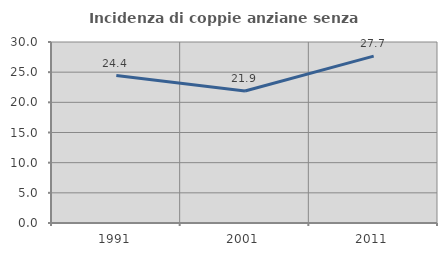
| Category | Incidenza di coppie anziane senza figli  |
|---|---|
| 1991.0 | 24.444 |
| 2001.0 | 21.875 |
| 2011.0 | 27.66 |